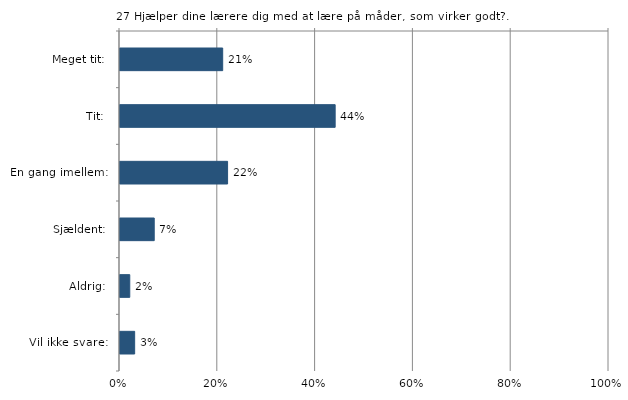
| Category | Hjælper dine lærere dig med at lære på måder, som virker godt? |
|---|---|
| Meget tit:  | 0.21 |
| Tit:  | 0.44 |
| En gang imellem:  | 0.22 |
| Sjældent:  | 0.07 |
| Aldrig:  | 0.02 |
| Vil ikke svare:  | 0.03 |